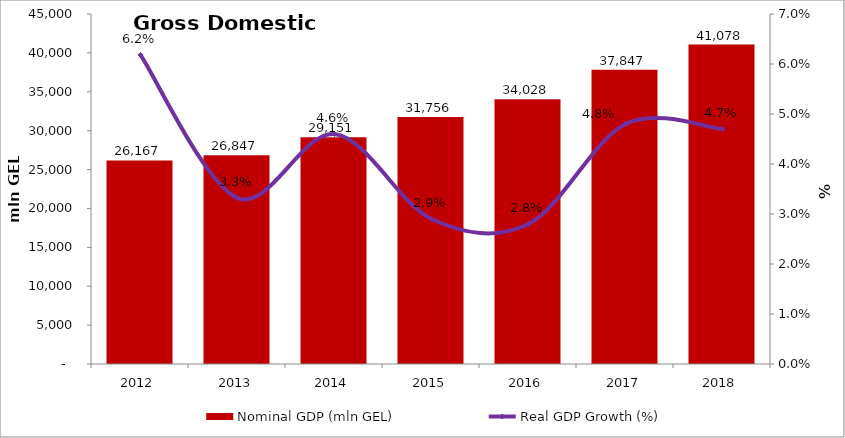
| Category | Nominal GDP (mln GEL) |
|---|---|
| 2012.0 | 26167.284 |
| 2013.0 | 26847.354 |
| 2014.0 | 29150.5 |
| 2015.0 | 31755.6 |
| 2016.0 | 34028.452 |
| 2017.0 | 37846.6 |
| 2018.0 | 41077.5 |